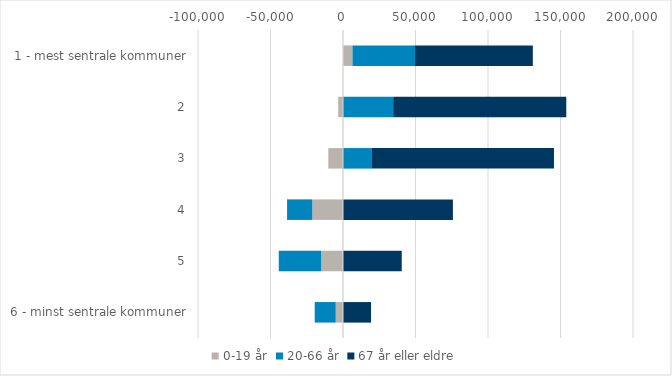
| Category | 0-19 år | 20-66 år | 67 år eller eldre |
|---|---|---|---|
| 1 - mest sentrale kommuner | 6534 | 43143 | 81242 |
| 2 | -3310 | 34632 | 119359 |
| 3 | -10135 | 19614 | 125882 |
| 4 | -21185 | -17394 | 75800 |
| 5 | -15158 | -29134 | 40512 |
| 6 - minst sentrale kommuner | -5021 | -14488 | 19354 |